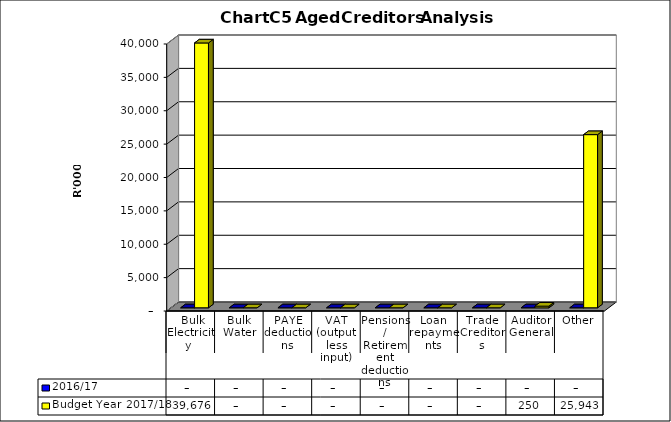
| Category | 2016/17 | Budget Year 2017/18 |
|---|---|---|
|  Bulk Electricity  | 0 | 39676416.23 |
| Bulk Water | 0 | 0 |
| PAYE deductions | 0 | 0 |
| VAT (output less input) | 0 | 0 |
| Pensions / Retirement deductions | 0 | 0 |
| Loan repayments | 0 | 0 |
| Trade Creditors | 0 | 0 |
| Auditor General | 0 | 249568.07 |
| Other | 0 | 25943194.3 |